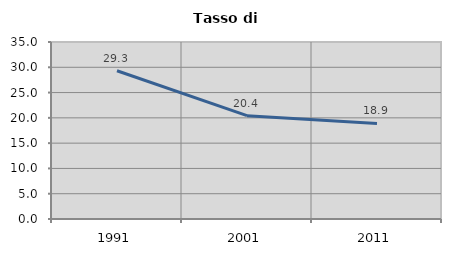
| Category | Tasso di disoccupazione   |
|---|---|
| 1991.0 | 29.31 |
| 2001.0 | 20.426 |
| 2011.0 | 18.885 |